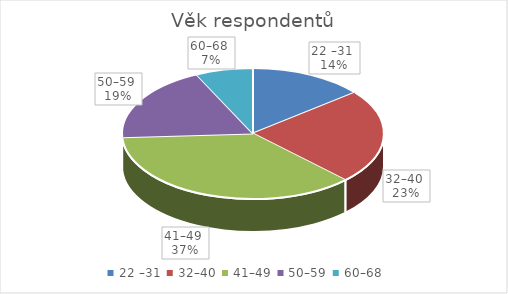
| Category | Series 0 |
|---|---|
| 22 –31  | 28 |
| 32–40  | 46 |
| 41–49  | 72 |
| 50–59  | 37 |
| 60–68  | 14 |